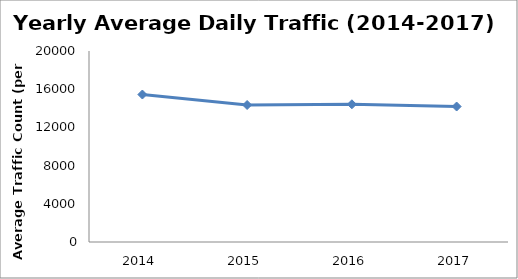
| Category | Series 0 |
|---|---|
| 2014.0 | 15441.975 |
| 2015.0 | 14346.189 |
| 2016.0 | 14419.658 |
| 2017.0 | 14185.721 |